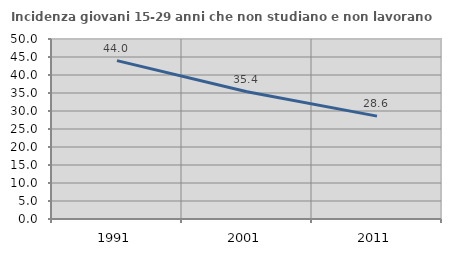
| Category | Incidenza giovani 15-29 anni che non studiano e non lavorano  |
|---|---|
| 1991.0 | 44 |
| 2001.0 | 35.366 |
| 2011.0 | 28.571 |